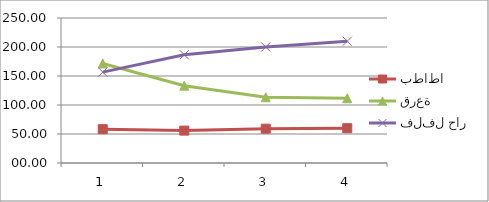
| Category | بطاطا | قرعة | فلفل حار |
|---|---|---|---|
| 0 | 58.33 | 171.67 | 156.67 |
| 1 | 55.83 | 133.33 | 186.67 |
| 2 | 59.17 | 113.33 | 200 |
| 3 | 60 | 111.67 | 210 |